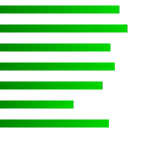
| Category | Series 0 |
|---|---|
| 0 | 0.158 |
| 1 | 0.169 |
| 2 | 0.146 |
| 3 | 0.152 |
| 4 | 0.135 |
| 5 | 0.097 |
| 6 | 0.144 |